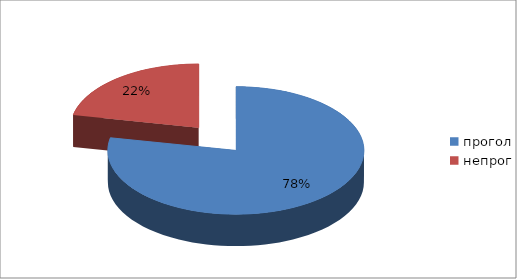
| Category | Series 0 |
|---|---|
| прогол | 129 |
| непрог | 36 |